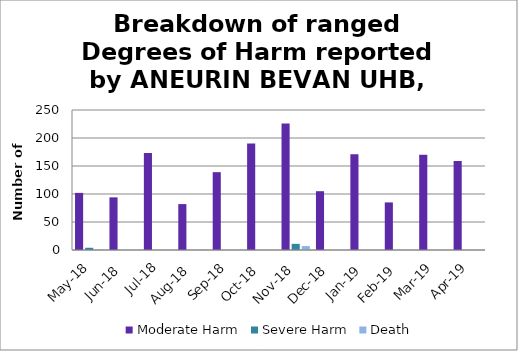
| Category | Moderate Harm | Severe Harm | Death |
|---|---|---|---|
| May-18 | 102 | 4 | 1 |
| Jun-18 | 94 | 0 | 0 |
| Jul-18 | 173 | 0 | 0 |
| Aug-18 | 82 | 0 | 1 |
| Sep-18 | 139 | 0 | 0 |
| Oct-18 | 190 | 0 | 0 |
| Nov-18 | 226 | 11 | 7 |
| Dec-18 | 105 | 0 | 0 |
| Jan-19 | 171 | 0 | 0 |
| Feb-19 | 85 | 0 | 0 |
| Mar-19 | 170 | 0 | 0 |
| Apr-19 | 159 | 0 | 0 |